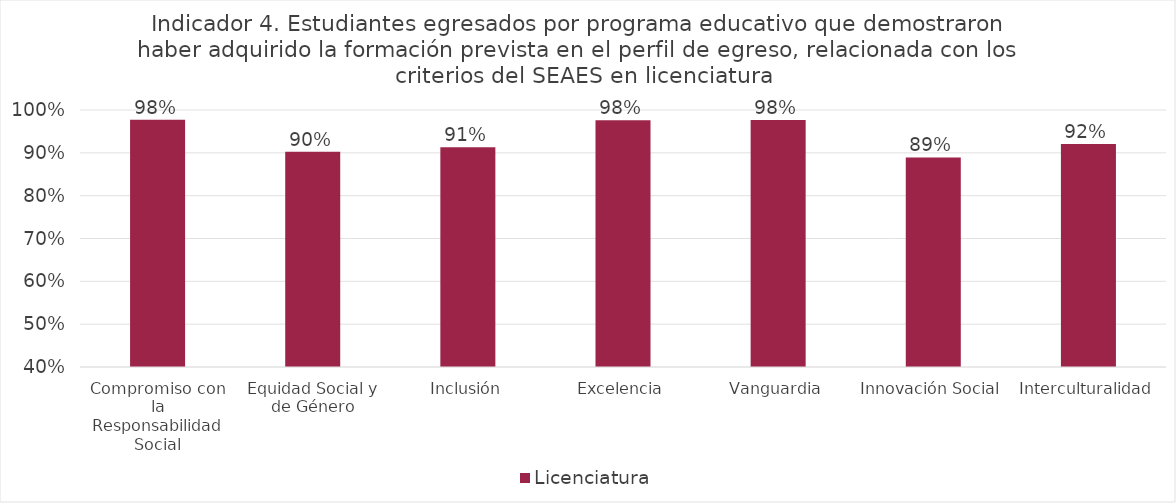
| Category | Licenciatura |
|---|---|
| Compromiso con la Responsabilidad Social | 0.977 |
| Equidad Social y de Género | 0.903 |
| Inclusión | 0.913 |
| Excelencia | 0.976 |
| Vanguardia | 0.977 |
| Innovación Social | 0.889 |
| Interculturalidad | 0.921 |